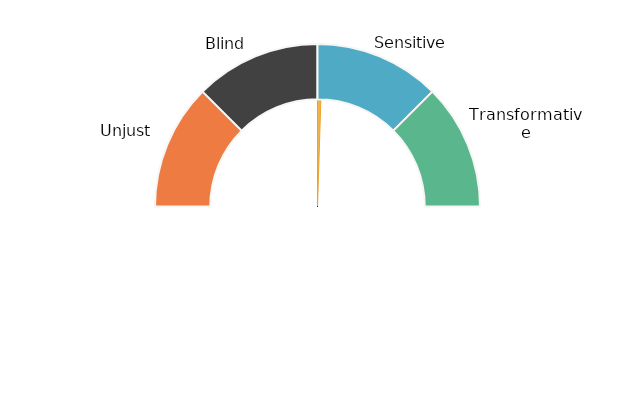
| Category | Needle |
|---|---|
| 0 | 50 |
| 1 | 1 |
| 2 | 149 |